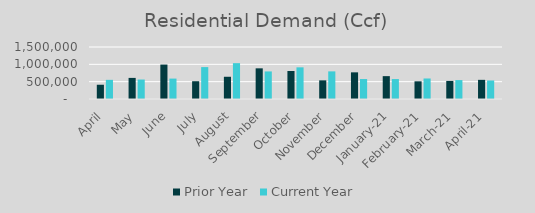
| Category | Prior Year | Current Year |
|---|---|---|
| April | 411179.62 | 552550.404 |
| May | 608563.54 | 561680.927 |
| June | 993563.54 | 588815.728 |
| July | 512849.55 | 920418.723 |
| August | 641515.25 | 1034271.241 |
| September | 884745.885 | 795392.365 |
| October | 808030.57 | 913450.318 |
| November | 537591.016 | 796803.85 |
| December | 768795.205 | 575698.992 |
| January-21 | 659359.876 | 574964.407 |
| February-21 | 510296.309 | 591912.627 |
| March-21 | 521598.856 | 545392.69 |
| April-21 | 552550.404 | 533967.423 |